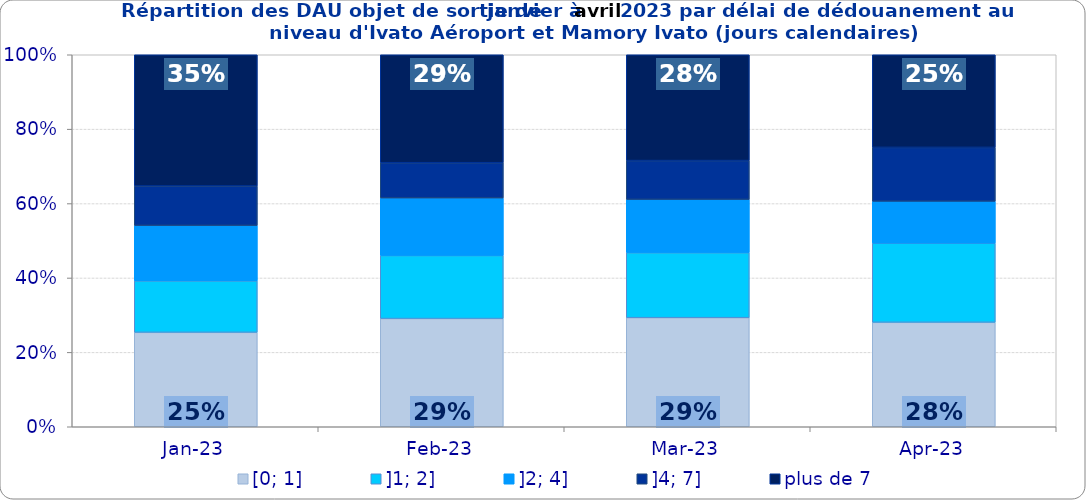
| Category | [0; 1] | ]1; 2] | ]2; 4] | ]4; 7] | plus de 7 |
|---|---|---|---|---|---|
| 2023-01-01 | 0.254 | 0.138 | 0.149 | 0.106 | 0.353 |
| 2023-02-01 | 0.291 | 0.17 | 0.155 | 0.095 | 0.29 |
| 2023-03-01 | 0.293 | 0.175 | 0.143 | 0.104 | 0.284 |
| 2023-04-01 | 0.281 | 0.213 | 0.113 | 0.145 | 0.249 |